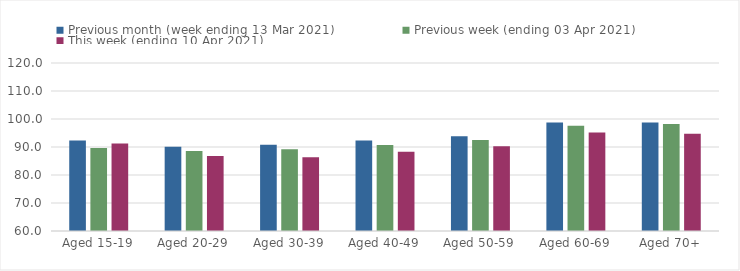
| Category | Previous month (week ending 13 Mar 2021) | Previous week (ending 03 Apr 2021) | This week (ending 10 Apr 2021) |
|---|---|---|---|
| Aged 15-19 | 92.33 | 89.65 | 91.26 |
| Aged 20-29 | 90.11 | 88.57 | 86.78 |
| Aged 30-39 | 90.8 | 89.17 | 86.38 |
| Aged 40-49 | 92.34 | 90.7 | 88.3 |
| Aged 50-59 | 93.82 | 92.53 | 90.28 |
| Aged 60-69 | 98.75 | 97.63 | 95.14 |
| Aged 70+ | 98.77 | 98.23 | 94.75 |